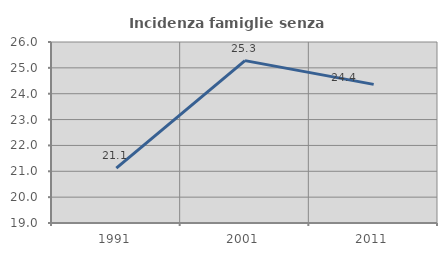
| Category | Incidenza famiglie senza nuclei |
|---|---|
| 1991.0 | 21.121 |
| 2001.0 | 25.279 |
| 2011.0 | 24.361 |